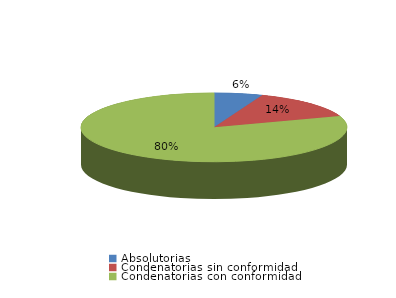
| Category | Series 0 |
|---|---|
| Absolutorias | 3 |
| Condenatorias sin conformidad | 7 |
| Condenatorias con conformidad | 41 |